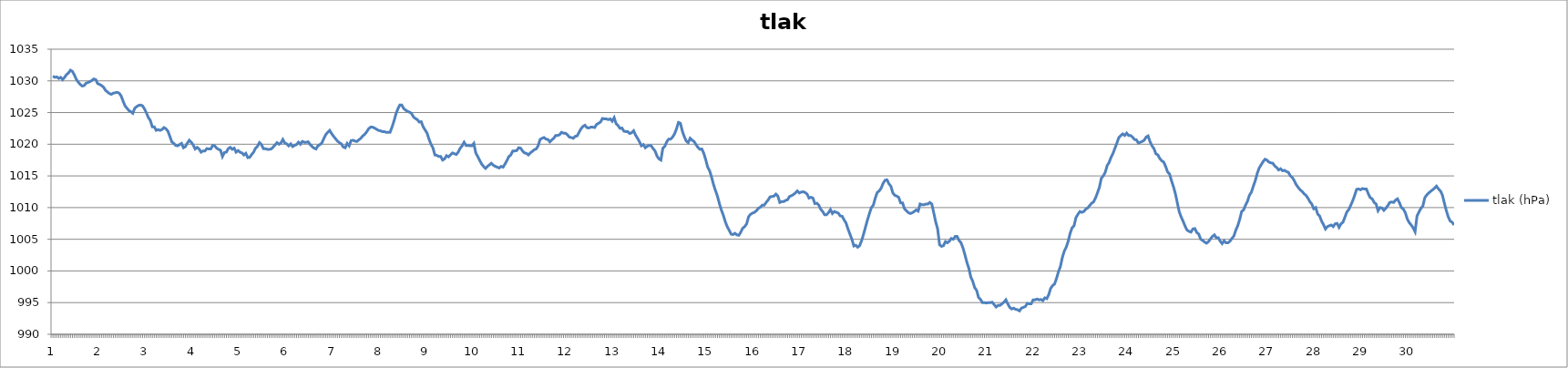
| Category | tlak (hPa) |
|---|---|
| 0 | 1030.75 |
| 1 | 1030.56 |
| 2 | 1030.63 |
| 3 | 1030.38 |
| 4 | 1030.56 |
| 5 | 1030.19 |
| 6 | 1030.56 |
| 7 | 1031 |
| 8 | 1031.25 |
| 9 | 1031.69 |
| 10 | 1031.5 |
| 11 | 1030.94 |
| 12 | 1030.25 |
| 13 | 1029.81 |
| 14 | 1029.44 |
| 15 | 1029.19 |
| 16 | 1029.25 |
| 17 | 1029.63 |
| 18 | 1029.75 |
| 19 | 1029.88 |
| 20 | 1030.06 |
| 21 | 1030.31 |
| 22 | 1030.19 |
| 23 | 1029.56 |
| 24 | 1029.44 |
| 25 | 1029.25 |
| 26 | 1029 |
| 27 | 1028.5 |
| 28 | 1028.25 |
| 29 | 1028 |
| 30 | 1027.88 |
| 31 | 1028.06 |
| 32 | 1028.13 |
| 33 | 1028.19 |
| 34 | 1028.06 |
| 35 | 1027.63 |
| 36 | 1026.81 |
| 37 | 1026.06 |
| 38 | 1025.69 |
| 39 | 1025.31 |
| 40 | 1025.13 |
| 41 | 1024.88 |
| 42 | 1025.69 |
| 43 | 1025.94 |
| 44 | 1026.13 |
| 45 | 1026.19 |
| 46 | 1026.06 |
| 47 | 1025.56 |
| 48 | 1024.94 |
| 49 | 1024.19 |
| 50 | 1023.75 |
| 51 | 1022.75 |
| 52 | 1022.75 |
| 53 | 1022.19 |
| 54 | 1022.31 |
| 55 | 1022.19 |
| 56 | 1022.31 |
| 57 | 1022.63 |
| 58 | 1022.44 |
| 59 | 1022.06 |
| 60 | 1021.25 |
| 61 | 1020.38 |
| 62 | 1020.13 |
| 63 | 1019.81 |
| 64 | 1019.75 |
| 65 | 1019.94 |
| 66 | 1020.13 |
| 67 | 1019.44 |
| 68 | 1019.63 |
| 69 | 1020.19 |
| 70 | 1020.63 |
| 71 | 1020.31 |
| 72 | 1019.88 |
| 73 | 1019.25 |
| 74 | 1019.5 |
| 75 | 1019.25 |
| 76 | 1018.75 |
| 77 | 1018.94 |
| 78 | 1018.94 |
| 79 | 1019.31 |
| 80 | 1019.25 |
| 81 | 1019.25 |
| 82 | 1019.81 |
| 83 | 1019.75 |
| 84 | 1019.38 |
| 85 | 1019.19 |
| 86 | 1019.06 |
| 87 | 1018.06 |
| 88 | 1018.69 |
| 89 | 1018.75 |
| 90 | 1019.31 |
| 91 | 1019.5 |
| 92 | 1019.19 |
| 93 | 1019.38 |
| 94 | 1018.75 |
| 95 | 1019 |
| 96 | 1018.75 |
| 97 | 1018.63 |
| 98 | 1018.31 |
| 99 | 1018.56 |
| 100 | 1017.88 |
| 101 | 1017.94 |
| 102 | 1018.38 |
| 103 | 1018.75 |
| 104 | 1019.38 |
| 105 | 1019.69 |
| 106 | 1020.25 |
| 107 | 1019.94 |
| 108 | 1019.31 |
| 109 | 1019.31 |
| 110 | 1019.19 |
| 111 | 1019.19 |
| 112 | 1019.25 |
| 113 | 1019.56 |
| 114 | 1019.88 |
| 115 | 1020.25 |
| 116 | 1020 |
| 117 | 1020.19 |
| 118 | 1020.75 |
| 119 | 1020.19 |
| 120 | 1020.06 |
| 121 | 1019.75 |
| 122 | 1020.06 |
| 123 | 1019.63 |
| 124 | 1019.81 |
| 125 | 1019.94 |
| 126 | 1020.31 |
| 127 | 1020 |
| 128 | 1020.44 |
| 129 | 1020.31 |
| 130 | 1020.31 |
| 131 | 1020.38 |
| 132 | 1019.94 |
| 133 | 1019.63 |
| 134 | 1019.38 |
| 135 | 1019.25 |
| 136 | 1019.75 |
| 137 | 1019.94 |
| 138 | 1020.19 |
| 139 | 1020.88 |
| 140 | 1021.5 |
| 141 | 1021.88 |
| 142 | 1022.19 |
| 143 | 1021.69 |
| 144 | 1021.25 |
| 145 | 1020.88 |
| 146 | 1020.5 |
| 147 | 1020.25 |
| 148 | 1020.06 |
| 149 | 1019.56 |
| 150 | 1019.44 |
| 151 | 1020.13 |
| 152 | 1019.75 |
| 153 | 1020.56 |
| 154 | 1020.63 |
| 155 | 1020.5 |
| 156 | 1020.44 |
| 157 | 1020.69 |
| 158 | 1020.94 |
| 159 | 1021.31 |
| 160 | 1021.56 |
| 161 | 1021.94 |
| 162 | 1022.44 |
| 163 | 1022.69 |
| 164 | 1022.69 |
| 165 | 1022.56 |
| 166 | 1022.38 |
| 167 | 1022.19 |
| 168 | 1022.13 |
| 169 | 1022 |
| 170 | 1022 |
| 171 | 1021.88 |
| 172 | 1021.88 |
| 173 | 1021.88 |
| 174 | 1022.69 |
| 175 | 1023.63 |
| 176 | 1024.75 |
| 177 | 1025.56 |
| 178 | 1026.19 |
| 179 | 1026.19 |
| 180 | 1025.63 |
| 181 | 1025.38 |
| 182 | 1025.19 |
| 183 | 1025.06 |
| 184 | 1024.88 |
| 185 | 1024.31 |
| 186 | 1024.06 |
| 187 | 1023.88 |
| 188 | 1023.5 |
| 189 | 1023.56 |
| 190 | 1022.75 |
| 191 | 1022.25 |
| 192 | 1021.75 |
| 193 | 1020.81 |
| 194 | 1020 |
| 195 | 1019.44 |
| 196 | 1018.31 |
| 197 | 1018.25 |
| 198 | 1018.06 |
| 199 | 1018.06 |
| 200 | 1017.5 |
| 201 | 1017.69 |
| 202 | 1018.19 |
| 203 | 1018 |
| 204 | 1018.31 |
| 205 | 1018.63 |
| 206 | 1018.5 |
| 207 | 1018.38 |
| 208 | 1018.75 |
| 209 | 1019.38 |
| 210 | 1019.75 |
| 211 | 1020.31 |
| 212 | 1019.81 |
| 213 | 1019.81 |
| 214 | 1019.75 |
| 215 | 1019.75 |
| 216 | 1020.13 |
| 217 | 1018.63 |
| 218 | 1018.06 |
| 219 | 1017.44 |
| 220 | 1016.88 |
| 221 | 1016.5 |
| 222 | 1016.19 |
| 223 | 1016.5 |
| 224 | 1016.75 |
| 225 | 1017 |
| 226 | 1016.69 |
| 227 | 1016.5 |
| 228 | 1016.38 |
| 229 | 1016.25 |
| 230 | 1016.5 |
| 231 | 1016.38 |
| 232 | 1016.88 |
| 233 | 1017.44 |
| 234 | 1018.06 |
| 235 | 1018.31 |
| 236 | 1018.94 |
| 237 | 1018.94 |
| 238 | 1019 |
| 239 | 1019.44 |
| 240 | 1019.38 |
| 241 | 1018.94 |
| 242 | 1018.63 |
| 243 | 1018.56 |
| 244 | 1018.31 |
| 245 | 1018.63 |
| 246 | 1018.88 |
| 247 | 1019.13 |
| 248 | 1019.25 |
| 249 | 1019.75 |
| 250 | 1020.75 |
| 251 | 1020.94 |
| 252 | 1021.06 |
| 253 | 1020.81 |
| 254 | 1020.75 |
| 255 | 1020.38 |
| 256 | 1020.69 |
| 257 | 1020.94 |
| 258 | 1021.38 |
| 259 | 1021.38 |
| 260 | 1021.5 |
| 261 | 1021.88 |
| 262 | 1021.75 |
| 263 | 1021.75 |
| 264 | 1021.5 |
| 265 | 1021.13 |
| 266 | 1021.06 |
| 267 | 1020.94 |
| 268 | 1021.25 |
| 269 | 1021.31 |
| 270 | 1021.88 |
| 271 | 1022.44 |
| 272 | 1022.81 |
| 273 | 1023 |
| 274 | 1022.63 |
| 275 | 1022.56 |
| 276 | 1022.69 |
| 277 | 1022.69 |
| 278 | 1022.63 |
| 279 | 1023.13 |
| 280 | 1023.31 |
| 281 | 1023.5 |
| 282 | 1024.06 |
| 283 | 1024 |
| 284 | 1024 |
| 285 | 1023.88 |
| 286 | 1024 |
| 287 | 1023.63 |
| 288 | 1024.19 |
| 289 | 1023.25 |
| 290 | 1022.94 |
| 291 | 1022.5 |
| 292 | 1022.56 |
| 293 | 1022.06 |
| 294 | 1022 |
| 295 | 1022 |
| 296 | 1021.69 |
| 297 | 1021.81 |
| 298 | 1022.13 |
| 299 | 1021.44 |
| 300 | 1020.94 |
| 301 | 1020.38 |
| 302 | 1019.75 |
| 303 | 1019.94 |
| 304 | 1019.44 |
| 305 | 1019.69 |
| 306 | 1019.81 |
| 307 | 1019.75 |
| 308 | 1019.31 |
| 309 | 1018.94 |
| 310 | 1018.13 |
| 311 | 1017.69 |
| 312 | 1017.5 |
| 313 | 1019.38 |
| 314 | 1019.69 |
| 315 | 1020.38 |
| 316 | 1020.81 |
| 317 | 1020.81 |
| 318 | 1021.13 |
| 319 | 1021.63 |
| 320 | 1022.44 |
| 321 | 1023.44 |
| 322 | 1023.31 |
| 323 | 1022.06 |
| 324 | 1021.19 |
| 325 | 1020.5 |
| 326 | 1020.25 |
| 327 | 1020.94 |
| 328 | 1020.63 |
| 329 | 1020.44 |
| 330 | 1019.94 |
| 331 | 1019.5 |
| 332 | 1019.19 |
| 333 | 1019.25 |
| 334 | 1018.56 |
| 335 | 1017.56 |
| 336 | 1016.38 |
| 337 | 1015.81 |
| 338 | 1014.81 |
| 339 | 1013.63 |
| 340 | 1012.69 |
| 341 | 1011.81 |
| 342 | 1010.63 |
| 343 | 1009.63 |
| 344 | 1008.81 |
| 345 | 1007.81 |
| 346 | 1007 |
| 347 | 1006.44 |
| 348 | 1005.81 |
| 349 | 1005.75 |
| 350 | 1005.94 |
| 351 | 1005.69 |
| 352 | 1005.63 |
| 353 | 1006.13 |
| 354 | 1006.75 |
| 355 | 1007 |
| 356 | 1007.44 |
| 357 | 1008.56 |
| 358 | 1008.94 |
| 359 | 1009.13 |
| 360 | 1009.25 |
| 361 | 1009.5 |
| 362 | 1009.88 |
| 363 | 1010.06 |
| 364 | 1010.38 |
| 365 | 1010.38 |
| 366 | 1010.81 |
| 367 | 1011.19 |
| 368 | 1011.69 |
| 369 | 1011.75 |
| 370 | 1011.81 |
| 371 | 1012.13 |
| 372 | 1011.81 |
| 373 | 1010.81 |
| 374 | 1010.94 |
| 375 | 1010.94 |
| 376 | 1011.13 |
| 377 | 1011.25 |
| 378 | 1011.75 |
| 379 | 1011.88 |
| 380 | 1012.06 |
| 381 | 1012.31 |
| 382 | 1012.63 |
| 383 | 1012.31 |
| 384 | 1012.44 |
| 385 | 1012.5 |
| 386 | 1012.38 |
| 387 | 1012.13 |
| 388 | 1011.5 |
| 389 | 1011.63 |
| 390 | 1011.5 |
| 391 | 1010.63 |
| 392 | 1010.69 |
| 393 | 1010.38 |
| 394 | 1009.75 |
| 395 | 1009.38 |
| 396 | 1008.88 |
| 397 | 1008.88 |
| 398 | 1009.19 |
| 399 | 1009.69 |
| 400 | 1009.06 |
| 401 | 1009.38 |
| 402 | 1009.25 |
| 403 | 1009.13 |
| 404 | 1008.69 |
| 405 | 1008.63 |
| 406 | 1008.06 |
| 407 | 1007.56 |
| 408 | 1006.63 |
| 409 | 1005.81 |
| 410 | 1005 |
| 411 | 1003.94 |
| 412 | 1004.06 |
| 413 | 1003.75 |
| 414 | 1004 |
| 415 | 1004.81 |
| 416 | 1005.81 |
| 417 | 1006.94 |
| 418 | 1008.06 |
| 419 | 1009.06 |
| 420 | 1010 |
| 421 | 1010.38 |
| 422 | 1011.5 |
| 423 | 1012.38 |
| 424 | 1012.63 |
| 425 | 1013.06 |
| 426 | 1013.81 |
| 427 | 1014.31 |
| 428 | 1014.38 |
| 429 | 1013.75 |
| 430 | 1013.38 |
| 431 | 1012.31 |
| 432 | 1011.94 |
| 433 | 1011.81 |
| 434 | 1011.63 |
| 435 | 1010.75 |
| 436 | 1010.75 |
| 437 | 1009.81 |
| 438 | 1009.5 |
| 439 | 1009.19 |
| 440 | 1009.06 |
| 441 | 1009.19 |
| 442 | 1009.38 |
| 443 | 1009.63 |
| 444 | 1009.44 |
| 445 | 1010.56 |
| 446 | 1010.44 |
| 447 | 1010.44 |
| 448 | 1010.56 |
| 449 | 1010.56 |
| 450 | 1010.81 |
| 451 | 1010.56 |
| 452 | 1009.19 |
| 453 | 1007.75 |
| 454 | 1006.63 |
| 455 | 1004.13 |
| 456 | 1003.88 |
| 457 | 1004 |
| 458 | 1004.63 |
| 459 | 1004.44 |
| 460 | 1004.69 |
| 461 | 1005.13 |
| 462 | 1005 |
| 463 | 1005.44 |
| 464 | 1005.44 |
| 465 | 1004.81 |
| 466 | 1004.44 |
| 467 | 1003.63 |
| 468 | 1002.56 |
| 469 | 1001.38 |
| 470 | 1000.44 |
| 471 | 999.06 |
| 472 | 998.38 |
| 473 | 997.38 |
| 474 | 996.94 |
| 475 | 995.81 |
| 476 | 995.5 |
| 477 | 995 |
| 478 | 995 |
| 479 | 994.94 |
| 480 | 995 |
| 481 | 995 |
| 482 | 995.06 |
| 483 | 994.69 |
| 484 | 994.31 |
| 485 | 994.56 |
| 486 | 994.56 |
| 487 | 994.81 |
| 488 | 995.06 |
| 489 | 995.44 |
| 490 | 994.81 |
| 491 | 994.25 |
| 492 | 994 |
| 493 | 994.13 |
| 494 | 993.94 |
| 495 | 993.88 |
| 496 | 993.69 |
| 497 | 994.13 |
| 498 | 994.25 |
| 499 | 994.38 |
| 500 | 994.88 |
| 501 | 994.81 |
| 502 | 994.81 |
| 503 | 995.44 |
| 504 | 995.44 |
| 505 | 995.56 |
| 506 | 995.44 |
| 507 | 995.5 |
| 508 | 995.31 |
| 509 | 995.75 |
| 510 | 995.63 |
| 511 | 996.25 |
| 512 | 997.25 |
| 513 | 997.69 |
| 514 | 997.94 |
| 515 | 998.81 |
| 516 | 999.88 |
| 517 | 1000.69 |
| 518 | 1002.13 |
| 519 | 1003.13 |
| 520 | 1003.75 |
| 521 | 1004.69 |
| 522 | 1005.94 |
| 523 | 1006.81 |
| 524 | 1007.13 |
| 525 | 1008.44 |
| 526 | 1008.94 |
| 527 | 1009.38 |
| 528 | 1009.25 |
| 529 | 1009.38 |
| 530 | 1009.75 |
| 531 | 1009.94 |
| 532 | 1010.31 |
| 533 | 1010.69 |
| 534 | 1010.88 |
| 535 | 1011.5 |
| 536 | 1012.31 |
| 537 | 1013.19 |
| 538 | 1014.63 |
| 539 | 1015 |
| 540 | 1015.56 |
| 541 | 1016.63 |
| 542 | 1017.13 |
| 543 | 1017.94 |
| 544 | 1018.56 |
| 545 | 1019.38 |
| 546 | 1020.19 |
| 547 | 1021.06 |
| 548 | 1021.38 |
| 549 | 1021.63 |
| 550 | 1021.38 |
| 551 | 1021.75 |
| 552 | 1021.38 |
| 553 | 1021.38 |
| 554 | 1021.13 |
| 555 | 1020.75 |
| 556 | 1020.69 |
| 557 | 1020.19 |
| 558 | 1020.31 |
| 559 | 1020.44 |
| 560 | 1020.63 |
| 561 | 1021.13 |
| 562 | 1021.31 |
| 563 | 1020.38 |
| 564 | 1019.75 |
| 565 | 1019.31 |
| 566 | 1018.5 |
| 567 | 1018.31 |
| 568 | 1017.75 |
| 569 | 1017.38 |
| 570 | 1017.19 |
| 571 | 1016.5 |
| 572 | 1015.63 |
| 573 | 1015.31 |
| 574 | 1014.25 |
| 575 | 1013.31 |
| 576 | 1012.19 |
| 577 | 1010.75 |
| 578 | 1009.31 |
| 579 | 1008.5 |
| 580 | 1007.81 |
| 581 | 1007.06 |
| 582 | 1006.44 |
| 583 | 1006.25 |
| 584 | 1006.13 |
| 585 | 1006.63 |
| 586 | 1006.69 |
| 587 | 1006.06 |
| 588 | 1005.81 |
| 589 | 1005 |
| 590 | 1004.81 |
| 591 | 1004.56 |
| 592 | 1004.38 |
| 593 | 1004.63 |
| 594 | 1005.06 |
| 595 | 1005.44 |
| 596 | 1005.69 |
| 597 | 1005.25 |
| 598 | 1005.25 |
| 599 | 1004.69 |
| 600 | 1004.31 |
| 601 | 1004.75 |
| 602 | 1004.44 |
| 603 | 1004.44 |
| 604 | 1004.69 |
| 605 | 1005.13 |
| 606 | 1005.5 |
| 607 | 1006.44 |
| 608 | 1007.13 |
| 609 | 1008.13 |
| 610 | 1009.38 |
| 611 | 1009.63 |
| 612 | 1010.38 |
| 613 | 1011 |
| 614 | 1011.94 |
| 615 | 1012.44 |
| 616 | 1013.38 |
| 617 | 1014.25 |
| 618 | 1015.38 |
| 619 | 1016.25 |
| 620 | 1016.75 |
| 621 | 1017.25 |
| 622 | 1017.63 |
| 623 | 1017.5 |
| 624 | 1017.19 |
| 625 | 1017.06 |
| 626 | 1017 |
| 627 | 1016.56 |
| 628 | 1016.31 |
| 629 | 1015.94 |
| 630 | 1016.13 |
| 631 | 1015.81 |
| 632 | 1015.88 |
| 633 | 1015.69 |
| 634 | 1015.56 |
| 635 | 1015 |
| 636 | 1014.75 |
| 637 | 1014.25 |
| 638 | 1013.63 |
| 639 | 1013.19 |
| 640 | 1012.81 |
| 641 | 1012.56 |
| 642 | 1012.19 |
| 643 | 1011.94 |
| 644 | 1011.5 |
| 645 | 1010.94 |
| 646 | 1010.56 |
| 647 | 1009.81 |
| 648 | 1010 |
| 649 | 1009 |
| 650 | 1008.69 |
| 651 | 1007.88 |
| 652 | 1007.31 |
| 653 | 1006.63 |
| 654 | 1007 |
| 655 | 1007.13 |
| 656 | 1007.25 |
| 657 | 1007 |
| 658 | 1007.44 |
| 659 | 1007.5 |
| 660 | 1006.88 |
| 661 | 1007.44 |
| 662 | 1007.69 |
| 663 | 1008.5 |
| 664 | 1009.31 |
| 665 | 1009.69 |
| 666 | 1010.38 |
| 667 | 1011.06 |
| 668 | 1011.94 |
| 669 | 1012.88 |
| 670 | 1012.94 |
| 671 | 1012.81 |
| 672 | 1013 |
| 673 | 1012.94 |
| 674 | 1012.94 |
| 675 | 1012.19 |
| 676 | 1011.56 |
| 677 | 1011.38 |
| 678 | 1010.81 |
| 679 | 1010.56 |
| 680 | 1009.5 |
| 681 | 1010 |
| 682 | 1009.94 |
| 683 | 1009.56 |
| 684 | 1009.88 |
| 685 | 1010.31 |
| 686 | 1010.81 |
| 687 | 1010.88 |
| 688 | 1010.81 |
| 689 | 1011.19 |
| 690 | 1011.38 |
| 691 | 1010.75 |
| 692 | 1010 |
| 693 | 1009.75 |
| 694 | 1009.19 |
| 695 | 1008.19 |
| 696 | 1007.63 |
| 697 | 1007.25 |
| 698 | 1006.81 |
| 699 | 1006.19 |
| 700 | 1008.69 |
| 701 | 1009.31 |
| 702 | 1009.88 |
| 703 | 1010.25 |
| 704 | 1011.56 |
| 705 | 1012 |
| 706 | 1012.31 |
| 707 | 1012.56 |
| 708 | 1012.81 |
| 709 | 1013.06 |
| 710 | 1013.38 |
| 711 | 1012.94 |
| 712 | 1012.63 |
| 713 | 1012 |
| 714 | 1010.75 |
| 715 | 1009.56 |
| 716 | 1008.56 |
| 717 | 1007.88 |
| 718 | 1007.69 |
| 719 | 1007.25 |